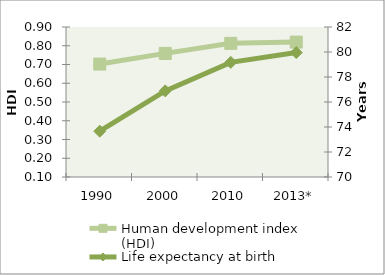
| Category | Human development index (HDI) |
|---|---|
| 1990 | 0.702 |
| 2000 | 0.759 |
| 2010 | 0.813 |
| 2013* | 0.819 |